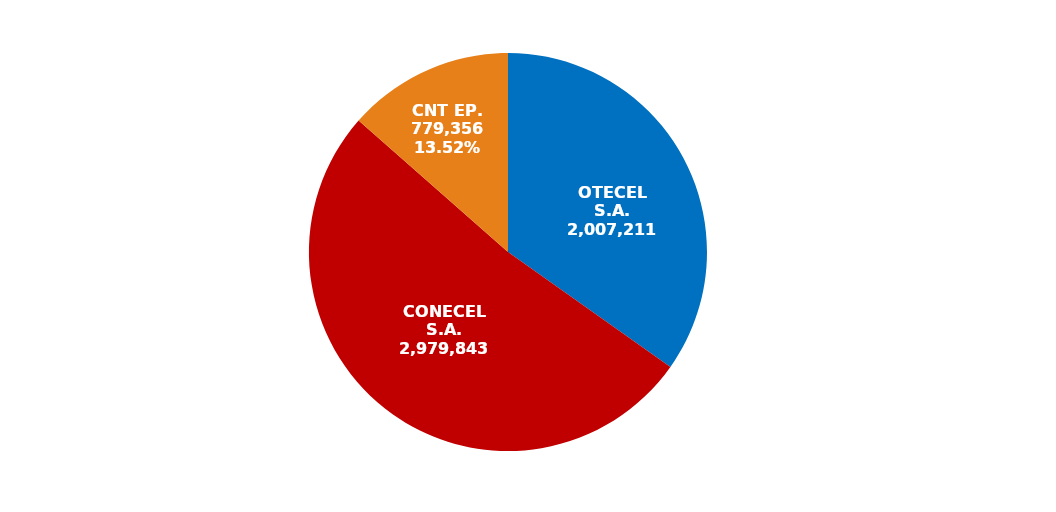
| Category | Series 0 |
|---|---|
| OTECEL S.A. | 2007211 |
| CONECEL S.A. | 2979843 |
| CNT EP. | 779356 |